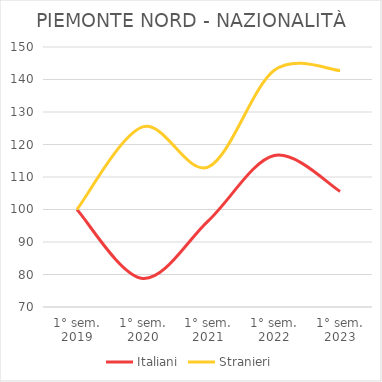
| Category | Italiani | Stranieri |
|---|---|---|
| 1° sem.
2019 | 100 | 100 |
| 1° sem.
2020 | 78.792 | 125.415 |
| 1° sem.
2021 | 96.579 | 113.122 |
| 1° sem.
2022 | 116.604 | 142.836 |
| 1° sem.
2023 | 105.585 | 142.785 |